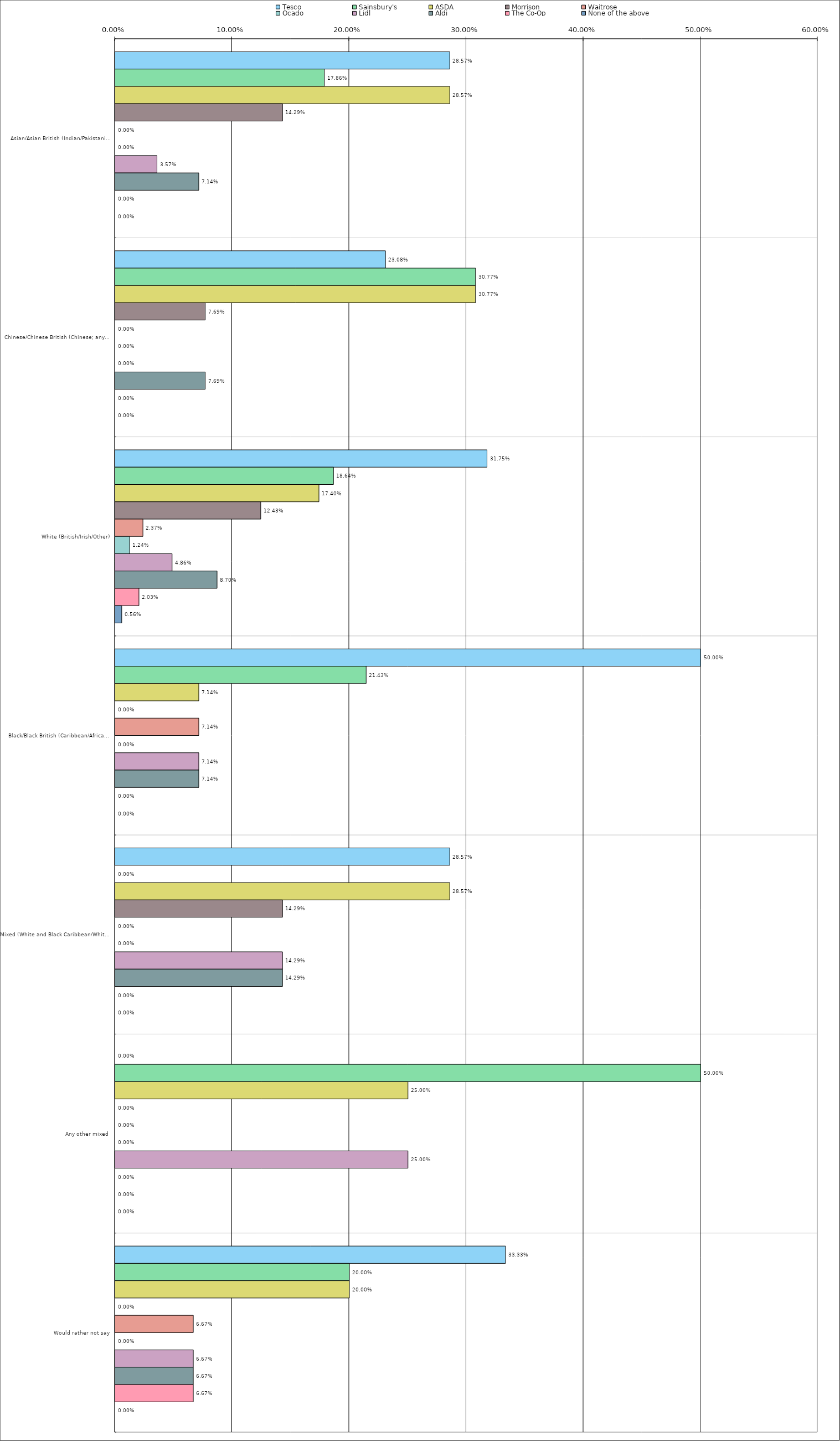
| Category | Tesco | Sainsbury's | ASDA | Morrison | Waitrose | Ocado | Lidl | Aldi | The Co-Op | None of the above |
|---|---|---|---|---|---|---|---|---|---|---|
| 0 | 0.286 | 0.179 | 0.286 | 0.143 | 0 | 0 | 0.036 | 0.071 | 0 | 0 |
| 1 | 0.231 | 0.308 | 0.308 | 0.077 | 0 | 0 | 0 | 0.077 | 0 | 0 |
| 2 | 0.318 | 0.186 | 0.174 | 0.124 | 0.024 | 0.012 | 0.049 | 0.087 | 0.02 | 0.006 |
| 3 | 0.5 | 0.214 | 0.071 | 0 | 0.071 | 0 | 0.071 | 0.071 | 0 | 0 |
| 4 | 0.286 | 0 | 0.286 | 0.143 | 0 | 0 | 0.143 | 0.143 | 0 | 0 |
| 5 | 0 | 0.5 | 0.25 | 0 | 0 | 0 | 0.25 | 0 | 0 | 0 |
| 6 | 0.333 | 0.2 | 0.2 | 0 | 0.067 | 0 | 0.067 | 0.067 | 0.067 | 0 |